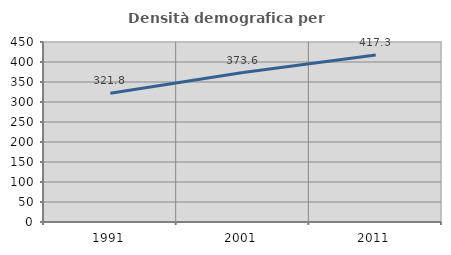
| Category | Densità demografica |
|---|---|
| 1991.0 | 321.776 |
| 2001.0 | 373.613 |
| 2011.0 | 417.325 |